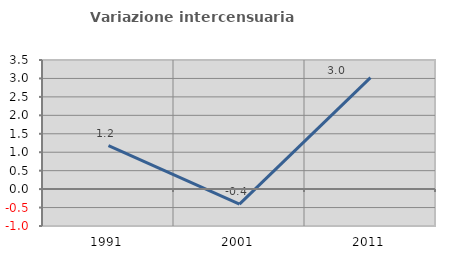
| Category | Variazione intercensuaria annua |
|---|---|
| 1991.0 | 1.181 |
| 2001.0 | -0.408 |
| 2011.0 | 3.024 |